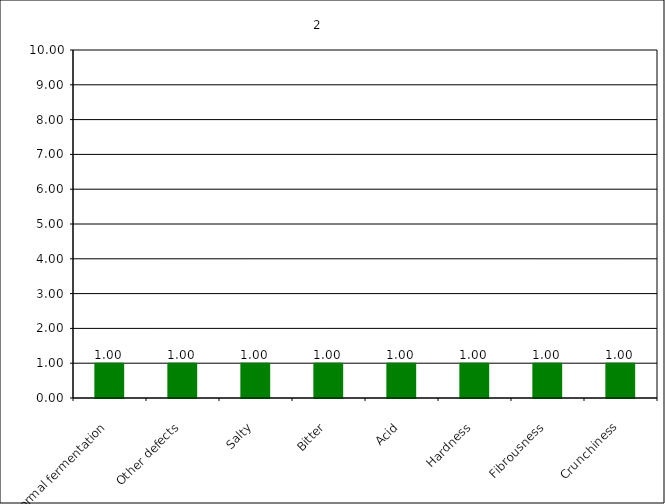
| Category | 2 |
|---|---|
| Abnormal fermentation | 1 |
| Other defects | 1 |
| Salty | 1 |
| Bitter | 1 |
| Acid | 1 |
| Hardness | 1 |
| Fibrousness | 1 |
| Crunchiness | 1 |